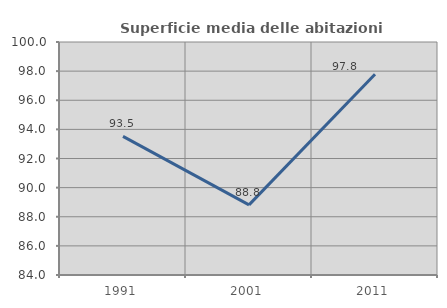
| Category | Superficie media delle abitazioni occupate |
|---|---|
| 1991.0 | 93.523 |
| 2001.0 | 88.815 |
| 2011.0 | 97.78 |